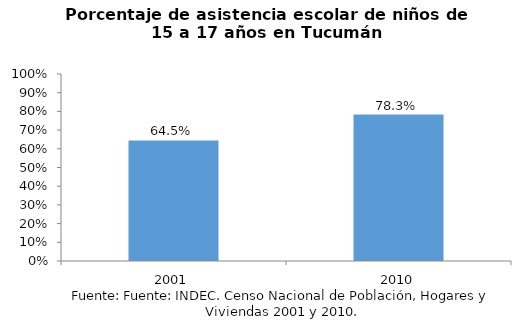
| Category | Series 0 |
|---|---|
| 2001.0 | 0.645 |
| 2010.0 | 0.783 |